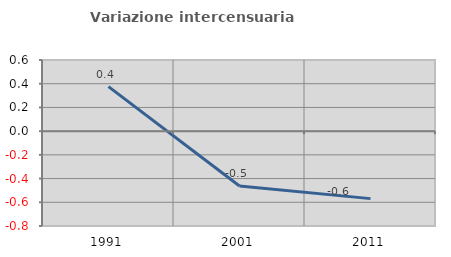
| Category | Variazione intercensuaria annua |
|---|---|
| 1991.0 | 0.376 |
| 2001.0 | -0.463 |
| 2011.0 | -0.569 |